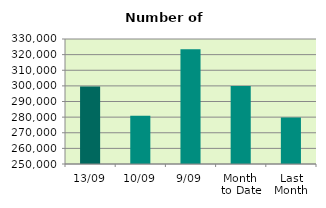
| Category | Series 0 |
|---|---|
| 13/09 | 299554 |
| 10/09 | 280848 |
| 9/09 | 323434 |
| Month 
to Date | 299851.333 |
| Last
Month | 279794.182 |